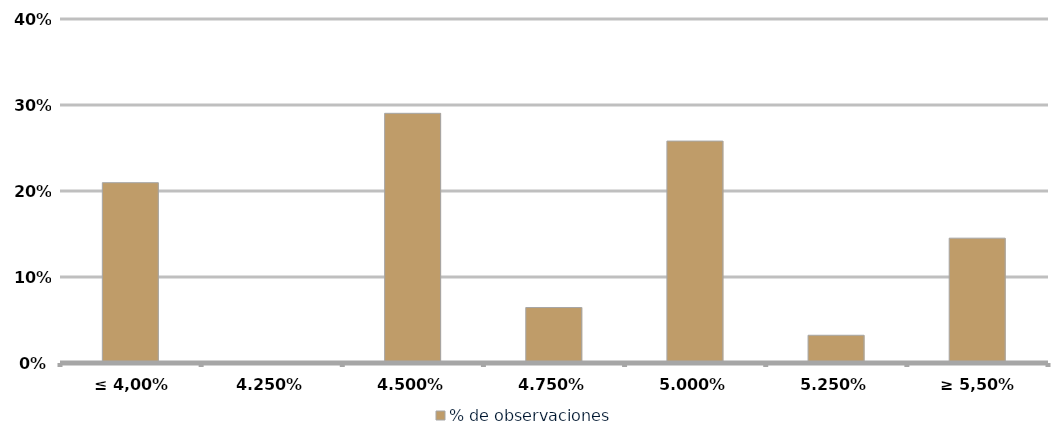
| Category | % de observaciones  |
|---|---|
| ≤ 4,00% | 0.21 |
| 4,25% | 0 |
| 4,50% | 0.29 |
| 4,75% | 0.065 |
| 5,00% | 0.258 |
| 5,25% | 0.032 |
| ≥ 5,50% | 0.145 |